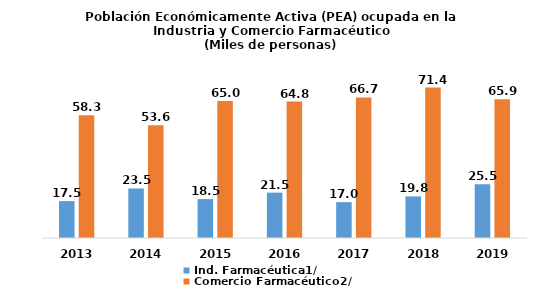
| Category | Ind. Farmacéutica1/ | Comercio Farmacéutico2/ |
|---|---|---|
| 2013.0 | 17.515 | 58.317 |
| 2014.0 | 23.522 | 53.55 |
| 2015.0 | 18.476 | 64.997 |
| 2016.0 | 21.533 | 64.804 |
| 2017.0 | 17.027 | 66.74 |
| 2018.0 | 19.758 | 71.444 |
| 2019.0 | 25.471 | 65.943 |